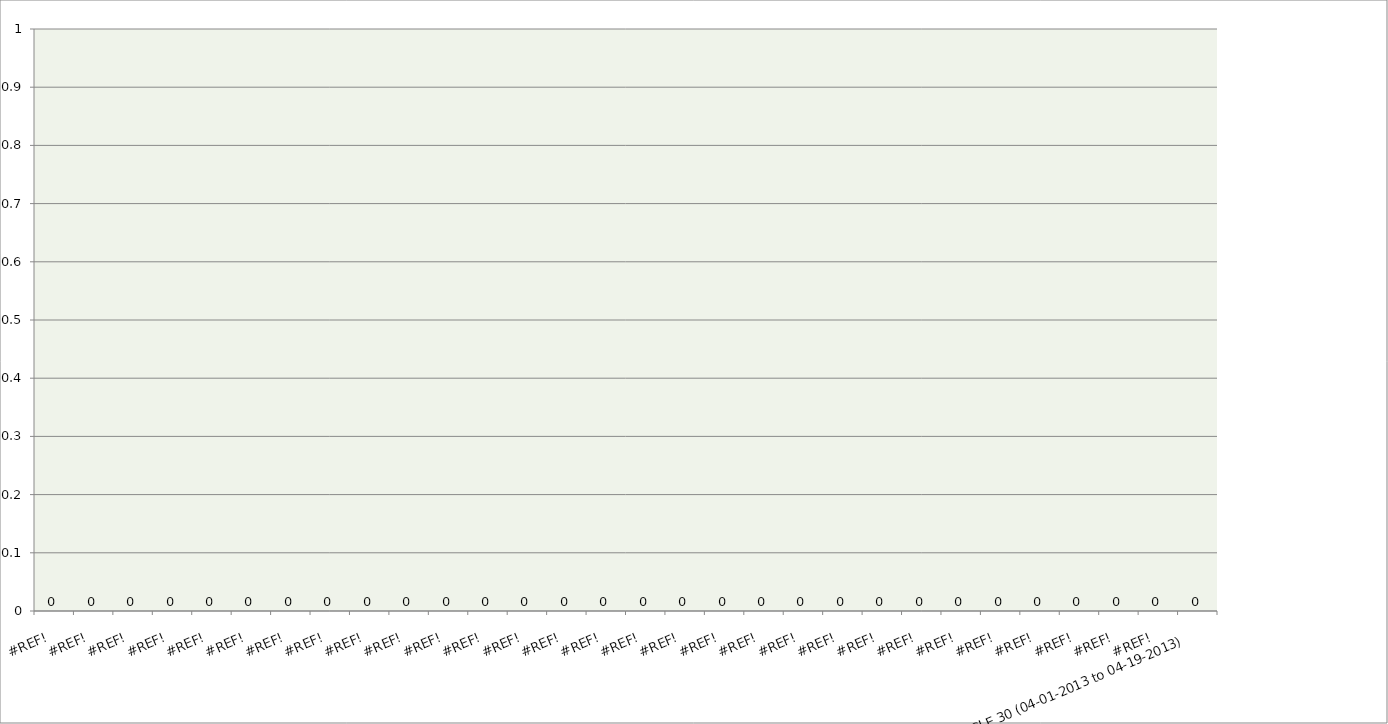
| Category | Series 0 |
|---|---|
| #REF! | 0 |
| #REF! | 0 |
| #REF! | 0 |
| #REF! | 0 |
| #REF! | 0 |
| #REF! | 0 |
| #REF! | 0 |
| #REF! | 0 |
| #REF! | 0 |
| #REF! | 0 |
| #REF! | 0 |
| #REF! | 0 |
| #REF! | 0 |
| #REF! | 0 |
| #REF! | 0 |
| #REF! | 0 |
| #REF! | 0 |
| #REF! | 0 |
| #REF! | 0 |
| #REF! | 0 |
| #REF! | 0 |
| #REF! | 0 |
| #REF! | 0 |
| #REF! | 0 |
| #REF! | 0 |
| #REF! | 0 |
| #REF! | 0 |
| #REF! | 0 |
| #REF! | 0 |
| CYCLE 30 (04-01-2013 to 04-19-2013) | 0 |